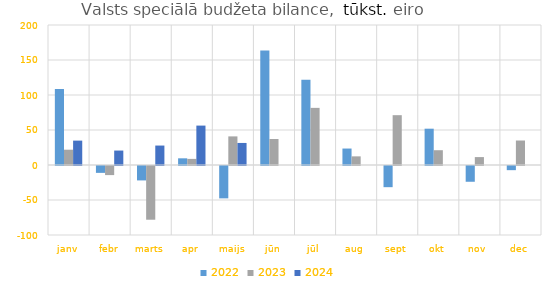
| Category | 2022 | 2023 | 2024 |
|---|---|---|---|
| janv | 108554.179 | 21850.373 | 34837.439 |
| febr | -9818.538 | -12989.478 | 20635.979 |
| marts | -20590.078 | -76739.856 | 27777.341 |
| apr | 9551.101 | 8730.038 | 56293.547 |
| maijs | -46228.723 | 40875.463 | 31496.225 |
| jūn | 163534.283 | 37142.428 | 0 |
| jūl | 121861.127 | 81614.598 | 0 |
| aug | 23515.069 | 12345.427 | 0 |
| sept | -30249.526 | 71171.512 | 0 |
| okt | 51869.404 | 21120.694 | 0 |
| nov | -22523.369 | 11303.868 | 0 |
| dec | -5948.69 | 34987.715 | 0 |